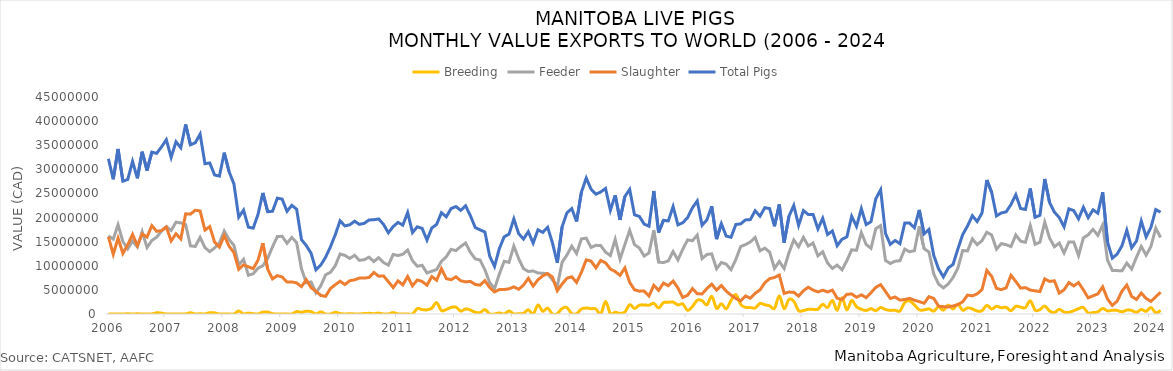
| Category | Breeding | Feeder | Slaughter | Total Pigs |
|---|---|---|---|---|
| 2006-01-01 | 0 | 16188880 | 16004471 | 32193351 |
| 2006-02-01 | 0 | 15535831 | 12390998 | 27926829 |
| 2006-03-01 | 0 | 18503718 | 15731492 | 34235210 |
| 2006-04-01 | 0 | 14990701 | 12563268 | 27553969 |
| 2006-05-01 | 38000 | 13508655 | 14342720 | 27889375 |
| 2006-06-01 | 0 | 15119292 | 16507490 | 31626782 |
| 2006-07-01 | 37093 | 13923157 | 14180102 | 28140352 |
| 2006-08-01 | 0 | 17060672 | 16595760 | 33656432 |
| 2006-09-01 | 22132 | 13789375 | 15944231 | 29755738 |
| 2006-10-01 | 0 | 15249140 | 18317220 | 33566360 |
| 2006-11-01 | 241380 | 15932440 | 17140122 | 33313942 |
| 2006-12-01 | 166150 | 17185610 | 17301057 | 34652817 |
| 2007-01-01 | 0 | 18110266 | 18032806 | 36143072 |
| 2007-02-01 | 0 | 17320524 | 15146810 | 32467334 |
| 2007-03-01 | 27467 | 19047457 | 16646885 | 35721809 |
| 2007-04-01 | 0 | 18898695 | 15573850 | 34472545 |
| 2007-05-01 | 0 | 18541027 | 20773734 | 39314761 |
| 2007-06-01 | 251147 | 14121701 | 20708692 | 35081540 |
| 2007-07-01 | 0 | 14006352 | 21515045 | 35521397 |
| 2007-08-01 | 44349 | 15898758 | 21357817 | 37300924 |
| 2007-09-01 | 0 | 13775827 | 17387786 | 31163613 |
| 2007-10-01 | 274288 | 12926434 | 18122063 | 31322785 |
| 2007-11-01 | 224016 | 13703922 | 14905006 | 28832944 |
| 2007-12-01 | 0 | 14729118 | 13876955 | 28606073 |
| 2008-01-01 | 0 | 17206036 | 16254609 | 33460645 |
| 2008-02-01 | 0 | 15457358 | 14058203 | 29515561 |
| 2008-03-01 | 0 | 14250245 | 12749126 | 26999371 |
| 2008-04-01 | 631761 | 10183388 | 9268881 | 20084030 |
| 2008-05-01 | 7075 | 11339242 | 10194082 | 21540399 |
| 2008-06-01 | 176451 | 8037021 | 9790925 | 18004397 |
| 2008-07-01 | 53919 | 8346137 | 9406808 | 17806864 |
| 2008-08-01 | 7654 | 9504222 | 11158534 | 20670410 |
| 2008-09-01 | 395637 | 10021778 | 14691450 | 25108865 |
| 2008-10-01 | 397276 | 11531661 | 9281819 | 21210756 |
| 2008-11-01 | 71881 | 13945399 | 7290921 | 21308201 |
| 2008-12-01 | 0 | 16063457 | 7962057 | 24025514 |
| 2009-01-01 | 24518 | 16118038 | 7671284 | 23813840 |
| 2009-02-01 | 0 | 14666830 | 6631607 | 21298437 |
| 2009-03-01 | 0 | 15879882 | 6654040 | 22533922 |
| 2009-04-01 | 493117 | 14798862 | 6435177 | 21727156 |
| 2009-05-01 | 357966 | 9384660 | 5684892 | 15427518 |
| 2009-06-01 | 584160 | 6487528 | 7113838 | 14185526 |
| 2009-07-01 | 481047 | 6647779 | 5446693 | 12575519 |
| 2009-08-01 | 0 | 4414247 | 4728180 | 9142427 |
| 2009-09-01 | 441088 | 5848015 | 3851702 | 10140805 |
| 2009-10-01 | 0 | 8120211 | 3663137 | 11783348 |
| 2009-11-01 | 0 | 8638452 | 5284166 | 13922618 |
| 2009-12-01 | 350927 | 10018479 | 6068207 | 16437613 |
| 2010-01-01 | 93839 | 12441666 | 6796801 | 19332306 |
| 2010-02-01 | 0 | 12161034 | 6102393 | 18263427 |
| 2010-03-01 | 69922 | 11529198 | 6900117 | 18499237 |
| 2010-04-01 | 0 | 12163467 | 7083242 | 19246709 |
| 2010-05-01 | 0 | 11127958 | 7459726 | 18587684 |
| 2010-06-01 | 95571 | 11257605 | 7446365 | 18799541 |
| 2010-07-01 | 135453 | 11788124 | 7579344 | 19502921 |
| 2010-08-01 | 66794 | 10867870 | 8609052 | 19543716 |
| 2010-09-01 | 186442 | 11688542 | 7835551 | 19710535 |
| 2010-10-01 | 0 | 10681617 | 7903227 | 18584844 |
| 2010-11-01 | 0 | 10129070 | 6705835 | 16834905 |
| 2010-12-01 | 293935 | 12350508 | 5481114 | 18125557 |
| 2011-01-01 | 0 | 12123108 | 6869612 | 18992720 |
| 2011-02-01 | 0 | 12388890 | 6037583 | 18426473 |
| 2011-03-01 | 0 | 13271229 | 7774785 | 21046014 |
| 2011-04-01 | 0 | 11049901 | 5840948 | 16890849 |
| 2011-05-01 | 1112792 | 9905353 | 7058476 | 18076621 |
| 2011-06-01 | 913242 | 10102572 | 6741145 | 17756959 |
| 2011-07-01 | 862957 | 8502900 | 5969867 | 15335724 |
| 2011-08-01 | 1210233 | 8877760 | 7756375 | 17844368 |
| 2011-09-01 | 2366205 | 9214002 | 6996530 | 18576737 |
| 2011-10-01 | 707523 | 10917333 | 9388252 | 21013108 |
| 2011-11-01 | 943183 | 11863649 | 7350102 | 20156934 |
| 2011-12-01 | 1359343 | 13405966 | 7101983 | 21867292 |
| 2012-01-01 | 1421392 | 13154553 | 7703763 | 22279708 |
| 2012-02-01 | 604763 | 13998704 | 6891844 | 21495311 |
| 2012-03-01 | 1056736 | 14720938 | 6663634 | 22441308 |
| 2012-04-01 | 824206 | 12797221 | 6764043 | 20385470 |
| 2012-05-01 | 361425 | 11439605 | 6135033 | 17936063 |
| 2012-06-01 | 282492 | 11185147 | 5979537 | 17447176 |
| 2012-07-01 | 926210 | 9171554 | 6918489 | 17016253 |
| 2012-08-01 | 0 | 6483314 | 5493441 | 11976755 |
| 2012-09-01 | 0 | 5299984 | 4569701 | 9869685 |
| 2012-10-01 | 207604 | 8295268 | 5075747 | 13578619 |
| 2012-11-01 | 0 | 10932649 | 5081658 | 16014307 |
| 2012-12-01 | 624958 | 10704609 | 5219504 | 16549071 |
| 2013-01-01 | 0 | 14100295 | 5617862 | 19718157 |
| 2013-02-01 | 57998 | 11484809 | 5127992 | 16670799 |
| 2013-03-01 | 144686 | 9399460 | 5990809 | 15534955 |
| 2013-04-01 | 863662 | 8818852 | 7392718 | 17075232 |
| 2013-05-01 | 0 | 8922987 | 5787087 | 14710074 |
| 2013-06-01 | 1863105 | 8499034 | 7101280 | 17463419 |
| 2013-07-01 | 559762 | 8451768 | 7917136 | 16928666 |
| 2013-08-01 | 1227687 | 8365006 | 8384063 | 17976756 |
| 2013-09-01 | 0 | 7087654 | 7655048 | 14742702 |
| 2013-10-01 | 67181 | 5729395 | 4823028 | 10619604 |
| 2013-11-01 | 1139737 | 10732043 | 6216014 | 18087794 |
| 2013-12-01 | 1332999 | 12232206 | 7417123 | 20982328 |
| 2014-01-01 | 84774 | 14070240 | 7719661 | 21874675 |
| 2014-02-01 | 78300 | 12542484 | 6553441 | 19174225 |
| 2014-03-01 | 1041676 | 15577218 | 8638979 | 25257873 |
| 2014-04-01 | 1229567 | 15723323 | 11237873 | 28190763 |
| 2014-05-01 | 1112351 | 13802577 | 10971128 | 25886056 |
| 2014-06-01 | 1042464 | 14238914 | 9564808 | 24846186 |
| 2014-07-01 | 0 | 14187120 | 11116386 | 25303506 |
| 2014-08-01 | 2600177 | 12824696 | 10609697 | 26034570 |
| 2014-09-01 | 49676 | 12115168 | 9346570 | 21511414 |
| 2014-10-01 | 346700 | 15488731 | 8792893 | 24628324 |
| 2014-11-01 | 129352 | 11372934 | 8011618 | 19513904 |
| 2014-12-01 | 390878 | 14417927 | 9546994 | 24355799 |
| 2015-01-01 | 1928863 | 17340020 | 6567036 | 25835919 |
| 2015-02-01 | 1149971 | 14401536 | 5027710 | 20579217 |
| 2015-03-01 | 1827896 | 13677602 | 4741679 | 20247177 |
| 2015-04-01 | 1880067 | 12021510 | 4749869 | 18651446 |
| 2015-05-01 | 1834106 | 12647097 | 3724731 | 18205934 |
| 2015-06-01 | 2205807 | 17338573 | 5959970 | 25504350 |
| 2015-07-01 | 1254780 | 10751914 | 4899615 | 16906309 |
| 2015-08-01 | 2354015 | 10665479 | 6406786 | 19426280 |
| 2015-09-01 | 2426022 | 10997353 | 5878053 | 19301428 |
| 2015-10-01 | 2476149 | 12960637 | 6832947 | 22269733 |
| 2015-11-01 | 1884401 | 11206546 | 5395306 | 18486253 |
| 2015-12-01 | 2083841 | 13412949 | 3428065 | 18924855 |
| 2016-01-01 | 751335 | 15366418 | 3870778 | 19988531 |
| 2016-02-01 | 1558169 | 15191678 | 5276329 | 22026176 |
| 2016-03-01 | 2854836 | 16365841 | 4219275 | 23439952 |
| 2016-04-01 | 2763206 | 11493642 | 4150977 | 18407825 |
| 2016-05-01 | 1902341 | 12343958 | 5278658 | 19524957 |
| 2016-06-01 | 3666317 | 12473370 | 6190399 | 22330086 |
| 2016-07-01 | 1186294 | 9376274 | 4958169 | 15520737 |
| 2016-08-01 | 2139916 | 10672862 | 5912745 | 18725523 |
| 2016-09-01 | 1069724 | 10344036 | 4746815 | 16160575 |
| 2016-10-01 | 2808407 | 9186764 | 3916038 | 15911209 |
| 2016-11-01 | 4026404 | 11315878 | 3220365 | 18562647 |
| 2016-12-01 | 1989073 | 13992877 | 2707717 | 18689667 |
| 2017-01-01 | 1373724 | 14394516 | 3744344 | 19512584 |
| 2017-02-01 | 1362559 | 14942406 | 3270953 | 19575918 |
| 2017-03-01 | 1243490 | 15870408 | 4299081 | 21412979 |
| 2017-04-01 | 2192885 | 13110764 | 4981544 | 20285193 |
| 2017-05-01 | 1914046 | 13652218 | 6476679 | 22042943 |
| 2017-06-01 | 1691012 | 12839791 | 7335977 | 21866780 |
| 2017-07-01 | 1167591 | 9453457 | 7565631 | 18186679 |
| 2017-08-01 | 3758303 | 10888645 | 8072074 | 22719022 |
| 2017-09-01 | 1102468 | 9434390 | 4276712 | 14813570 |
| 2017-10-01 | 3020597 | 12686186 | 4544674 | 20251457 |
| 2017-11-01 | 2647062 | 15351605 | 4508997 | 22507664 |
| 2017-12-01 | 705431 | 13962593 | 3711086 | 18379110 |
| 2018-01-01 | 717345 | 15895321 | 4833120 | 21445786 |
| 2018-02-01 | 974447 | 14103238 | 5546717 | 20624402 |
| 2018-03-01 | 961543 | 14714563 | 4973558 | 20649664 |
| 2018-04-01 | 988795 | 12066737 | 4584834 | 17640366 |
| 2018-05-01 | 2013086 | 12902623 | 4927509 | 19843218 |
| 2018-06-01 | 1338276 | 10571113 | 4571617 | 16481006 |
| 2018-07-01 | 2809004 | 9460205 | 4954854 | 17224063 |
| 2018-08-01 | 759613 | 10137402 | 3275244 | 14172259 |
| 2018-09-01 | 3373651 | 9153803 | 2976585 | 15504039 |
| 2018-10-01 | 844363 | 11060778 | 4083670 | 15988811 |
| 2018-11-01 | 2794399 | 13311895 | 4156111 | 20262405 |
| 2018-12-01 | 1492531 | 13206577 | 3477213 | 18176321 |
| 2019-01-01 | 983170 | 16884439 | 3970057 | 21837666 |
| 2019-02-01 | 732563 | 14414774 | 3392320 | 18539657 |
| 2019-03-01 | 1109151 | 13627918 | 4413044 | 19150113 |
| 2019-04-01 | 677644 | 17696185 | 5531226 | 23905055 |
| 2019-05-01 | 1340831 | 18339397 | 6088284 | 25768512 |
| 2019-06-01 | 924803 | 11112421 | 4663708 | 16700932 |
| 2019-07-01 | 751429 | 10465696 | 3225290 | 14442415 |
| 2019-08-01 | 782043 | 10951963 | 3518430 | 15252436 |
| 2019-09-01 | 633298 | 11055820 | 2882276 | 14571394 |
| 2019-10-01 | 2399862 | 13461468 | 3001638 | 18862968 |
| 2019-11-01 | 2700012 | 12897292 | 3251934 | 18849238 |
| 2019-12-01 | 1886432 | 13134124 | 2861793 | 17882349 |
| 2020-01-01 | 865422 | 18160251 | 2564526 | 21590199 |
| 2020-02-01 | 840624 | 13545818 | 2223558 | 16610000 |
| 2020-03-01 | 1068716 | 12875257 | 3587523 | 17531496 |
| 2020-04-01 | 598327 | 8315744 | 3241489 | 12155560 |
| 2020-05-01 | 1516661 | 6208267 | 1627573 | 9352501 |
| 2020-06-01 | 775186 | 5410928 | 1509698 | 7695812 |
| 2020-07-01 | 1853494 | 6225932 | 1462757 | 9542183 |
| 2020-08-01 | 1050391 | 7573568 | 1664927 | 10288886 |
| 2020-09-01 | 2015633 | 9508257 | 1955810 | 13479700 |
| 2020-10-01 | 779065 | 13165028 | 2525048 | 16469141 |
| 2020-11-01 | 1270703 | 13064755 | 3915472 | 18250930 |
| 2020-12-01 | 1054987 | 15578473 | 3755724 | 20389184 |
| 2021-01-01 | 616172 | 14378960 | 4176827 | 19171959 |
| 2021-02-01 | 689083 | 15210433 | 5059825 | 20959341 |
| 2021-03-01 | 1793813 | 16956738 | 9031200 | 27781751 |
| 2021-04-01 | 1046012 | 16381062 | 7807134 | 25234208 |
| 2021-05-01 | 1591707 | 13437555 | 5315704 | 20344966 |
| 2021-06-01 | 1301414 | 14596494 | 5055095 | 20953003 |
| 2021-07-01 | 1388410 | 14375164 | 5419512 | 21183086 |
| 2021-08-01 | 678991 | 13981255 | 8026668 | 22686914 |
| 2021-09-01 | 1605832 | 16381271 | 6745658 | 24732761 |
| 2021-10-01 | 1411582 | 15100133 | 5360229 | 21871944 |
| 2021-11-01 | 1333105 | 14875755 | 5476018 | 21684878 |
| 2021-12-01 | 2745333 | 18329453 | 4963625 | 26038411 |
| 2022-01-01 | 808014 | 14448871 | 4798530 | 20055415 |
| 2022-02-01 | 907260 | 14892983 | 4662870 | 20463113 |
| 2022-03-01 | 1651464 | 19057800 | 7288530 | 27997794 |
| 2022-04-01 | 634945 | 15747256 | 6752781 | 23134982 |
| 2022-05-01 | 285544 | 13945960 | 6890580 | 21122084 |
| 2022-06-01 | 966736 | 14705779 | 4335938 | 20008453 |
| 2022-07-01 | 388725 | 12655669 | 5023941 | 18068335 |
| 2022-08-01 | 337067 | 14952664 | 6516346 | 21806077 |
| 2022-09-01 | 679988 | 14942453 | 5831663 | 21454104 |
| 2022-10-01 | 1103912 | 12109189 | 6512601 | 19725702 |
| 2022-11-01 | 1350907 | 15758009 | 5017401 | 22126317 |
| 2022-12-01 | 206054 | 16423252 | 3357955 | 19987261 |
| 2023-01-01 | 295720 | 17544393 | 3764118 | 21604231 |
| 2023-02-01 | 439082 | 16295169 | 4173074 | 20907325 |
| 2023-03-01 | 1155512 | 18468631 | 5630902 | 25255045 |
| 2023-04-01 | 649642 | 11197991 | 3115683 | 14963316 |
| 2023-05-01 | 765332 | 9033619 | 1780716 | 11579667 |
| 2023-06-01 | 751435 | 8999744 | 2670413 | 12421592 |
| 2023-07-01 | 440496 | 8956622 | 4738054 | 14135172 |
| 2023-08-01 | 818982 | 10548100 | 6000920 | 17368002 |
| 2023-09-01 | 745387 | 9327835 | 3648695 | 13721917 |
| 2023-10-01 | 335336 | 11764242 | 3021387 | 15120965 |
| 2023-11-01 | 937869 | 14006945 | 4333767 | 19278581 |
| 2023-12-01 | 551133 | 12211354 | 3217068 | 15979555 |
| 2024-01-01 | 1347286 | 13991441 | 2616880 | 17955607 |
| 2024-02-01 | 261660 | 17814119 | 3579259 | 21655038 |
| 2024-03-01 | 735866 | 15866555 | 4512305 | 21114726 |